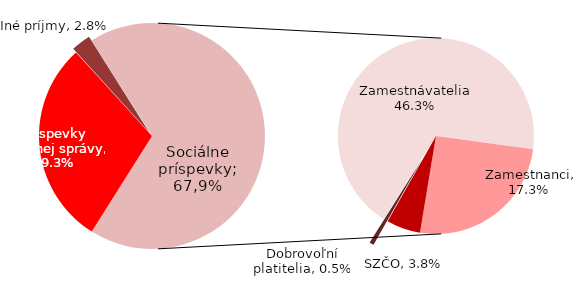
| Category | Series 0 |
|---|---|
| Príspevky verejnej správy | 0.293 |
| Iné príjmy | 0.028 |
| Zamestnávatelia | 0.463 |
| Zamestnanci | 0.173 |
| SZČO | 0.038 |
| Dobrovoľní platitelia | 0.005 |